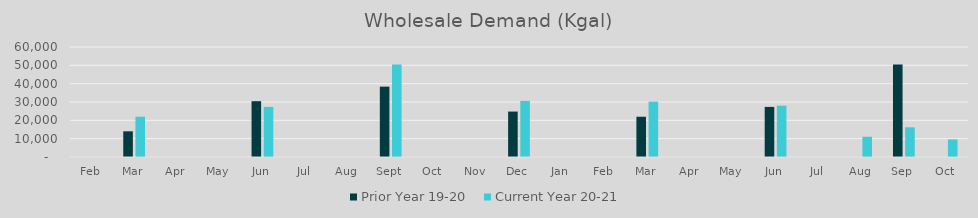
| Category | Prior Year 19-20  | Current Year 20-21 |
|---|---|---|
| Feb | 0 | 0 |
| Mar | 14013.78 | 21965.02 |
| Apr | 0 | 0 |
| May | 0 | 0 |
| Jun | 30443.6 | 27331 |
| Jul | 0 | 0 |
| Aug | 0 | 0 |
| Sep | 38376.14 | 50400.24 |
| Oct | 0 | 0 |
| Nov | 0 | 0 |
| Dec | 24784.98 | 30611.9 |
| Jan | 0 | 0 |
| Feb | 0 | 0 |
| Mar | 21965.02 | 30196.76 |
| Apr | 0 | 0 |
| May | 0 | 0 |
| Jun | 27331 | 27993.9 |
| Jul | 0 | 0 |
| Aug | 0 | 11056.179 |
| Sep | 50400.24 | 16202.763 |
| Oct | 0 | 9585.62 |